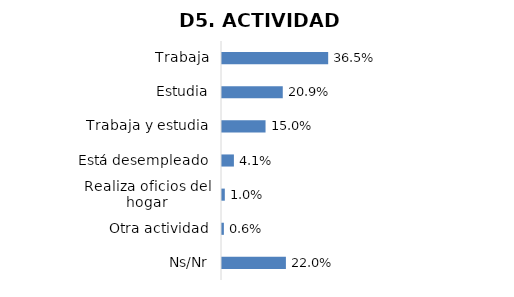
| Category | Series 0 |
|---|---|
| Trabaja | 0.365 |
| Estudia | 0.209 |
| Trabaja y estudia | 0.15 |
| Está desempleado | 0.041 |
| Realiza oficios del hogar | 0.01 |
| Otra actividad | 0.006 |
| Ns/Nr | 0.22 |